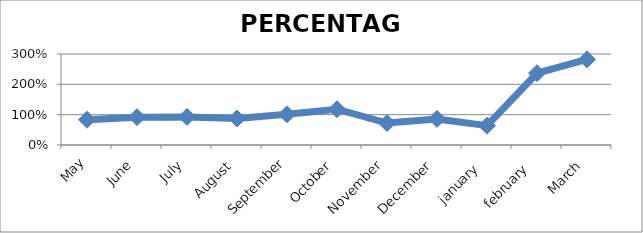
| Category | PERCENTAGE |
|---|---|
| May | 0.833 |
| June | 0.918 |
| July | 0.925 |
| August | 0.874 |
| September | 1.012 |
| October | 1.18 |
| November | 0.725 |
| December | 0.859 |
| january  | 0.639 |
| february  | 2.366 |
| March | 2.824 |